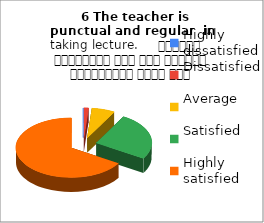
| Category |    6 The teacher is 
punctual and regular  in taking lecture.     शिक्षक समयनिष्ठ हैं एवं नियमित व्याख्यान देते हैं |
|---|---|
| Highly dissatisfied | 0 |
| Dissatisfied | 1 |
| Average | 5 |
| Satisfied | 19 |
| Highly satisfied | 49 |